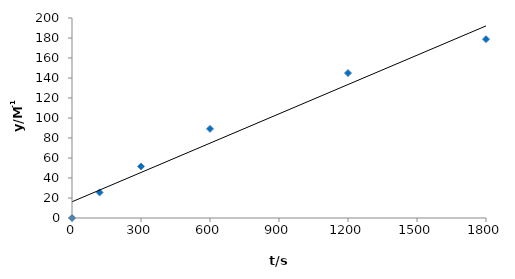
| Category | Series 0 |
|---|---|
| 0.0 | 0 |
| 120.0 | 25.57 |
| 300.0 | 51.569 |
| 600.0 | 89.133 |
| 1200.0 | 144.995 |
| 1800.0 | 178.785 |